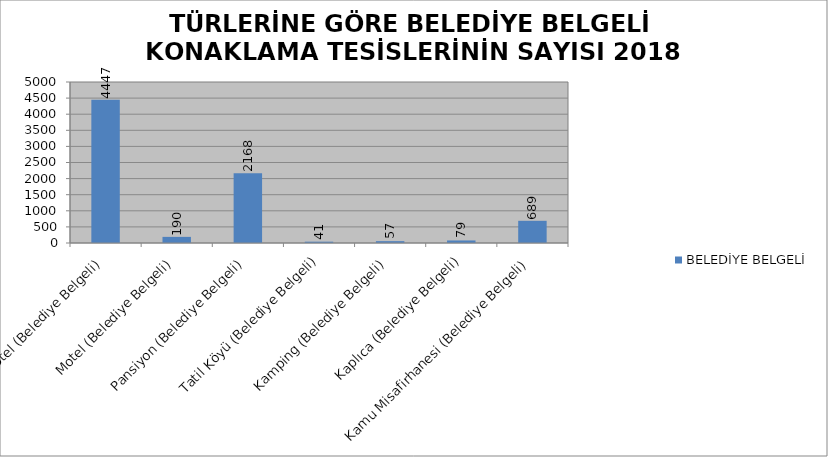
| Category | BELEDİYE BELGELİ |
|---|---|
| Otel (Belediye Belgeli) | 4447 |
| Motel (Belediye Belgeli) | 190 |
| Pansiyon (Belediye Belgeli) | 2168 |
| Tatil Köyü (Belediye Belgeli) | 41 |
| Kamping (Belediye Belgeli) | 57 |
| Kaplıca (Belediye Belgeli) | 79 |
| Kamu Misafirhanesi (Belediye Belgeli) | 689 |